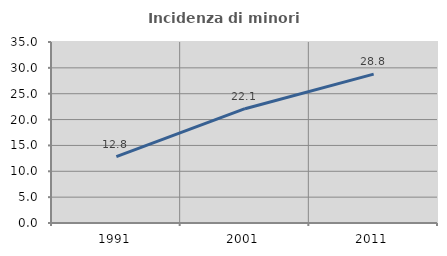
| Category | Incidenza di minori stranieri |
|---|---|
| 1991.0 | 12.821 |
| 2001.0 | 22.105 |
| 2011.0 | 28.782 |